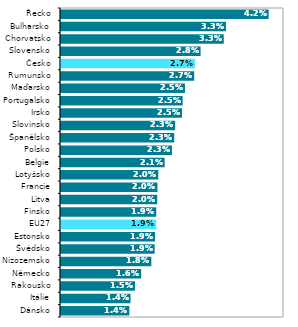
| Category | Series 1 |
|---|---|
| Dánsko | 0.014 |
| Itálie | 0.014 |
| Rakousko | 0.015 |
| Německo | 0.016 |
| Nizozemsko | 0.018 |
| Švédsko | 0.019 |
| Estonsko | 0.019 |
| EU27 | 0.019 |
| Finsko | 0.019 |
| Litva | 0.02 |
| Francie | 0.02 |
| Lotyšsko | 0.02 |
| Belgie | 0.021 |
| Polsko | 0.023 |
| Španělsko | 0.023 |
| Slovinsko | 0.023 |
| Irsko | 0.025 |
| Portugalsko | 0.025 |
| Maďarsko | 0.025 |
| Rumunsko | 0.027 |
| Česko | 0.027 |
| Slovensko | 0.028 |
| Chorvatsko | 0.033 |
| Bulharsko | 0.033 |
| Řecko | 0.042 |